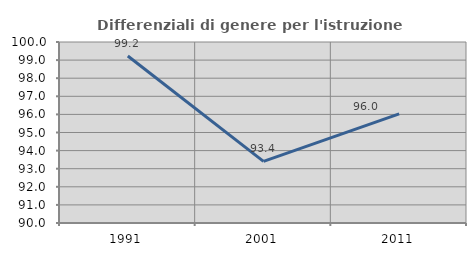
| Category | Differenziali di genere per l'istruzione superiore |
|---|---|
| 1991.0 | 99.225 |
| 2001.0 | 93.404 |
| 2011.0 | 96.025 |